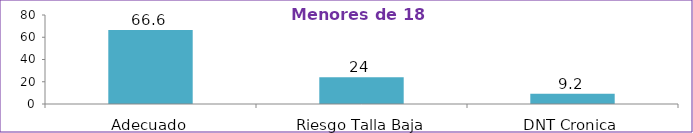
| Category | Series 0 |
|---|---|
| Adecuado | 66.6 |
| Riesgo Talla Baja | 24 |
| DNT Cronica | 9.2 |